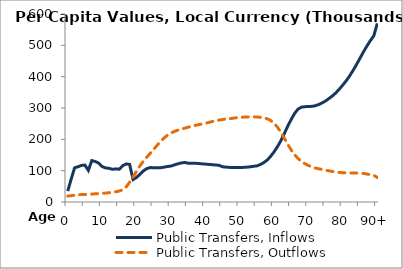
| Category | Public Transfers, Inflows | Public Transfers, Outflows |
|---|---|---|
| 0 | 34879.841 | 18996.704 |
|  | 72892.206 | 20106.775 |
| 2 | 109004.787 | 21738.521 |
| 3 | 112575.426 | 23125.178 |
| 4 | 116744.755 | 23731.721 |
| 5 | 117836.761 | 24202.952 |
| 6 | 100915.563 | 24723.896 |
| 7 | 132222.957 | 25342.67 |
| 8 | 129228.992 | 26212.62 |
| 9 | 124129.336 | 26925.791 |
| 10 | 113133.048 | 27670.958 |
| 11 | 108729.135 | 28435.279 |
| 12 | 107589.406 | 29556.714 |
| 13 | 104226.538 | 30904.255 |
| 14 | 105740.628 | 32718.973 |
| 15 | 104729.964 | 35036.273 |
| 16 | 116117.049 | 38945.816 |
| 17 | 121457.303 | 48446.689 |
| 18 | 120020.654 | 63153.015 |
| 19 | 71570.667 | 80257.789 |
| 20 | 78016.6 | 98097.733 |
| 21 | 88588.573 | 115359.746 |
| 22 | 99195.081 | 130493.272 |
| 23 | 106604.843 | 143275.066 |
| 24 | 109875.766 | 155463.717 |
| 25 | 109397.478 | 168188.511 |
| 26 | 108970.756 | 181076.266 |
| 27 | 109423.452 | 193271.755 |
| 28 | 111268.753 | 204259.217 |
| 29 | 113388.093 | 213332.789 |
| 30 | 114650.589 | 220158.737 |
| 31 | 118428.779 | 225096.363 |
| 32 | 121774.899 | 229092.545 |
| 33 | 124530.019 | 232438.655 |
| 34 | 126117.739 | 235542.268 |
| 35 | 123720.122 | 238771.463 |
| 36 | 123834.399 | 241770.445 |
| 37 | 123571.686 | 244261.067 |
| 38 | 122849.816 | 246691.266 |
| 39 | 121833.739 | 249056.987 |
| 40 | 120987.265 | 251240.786 |
| 41 | 120015.77 | 253834.051 |
| 42 | 119079.863 | 256817.554 |
| 43 | 118131.9 | 259210.635 |
| 44 | 117010.485 | 261223.044 |
| 45 | 112487.352 | 263313.799 |
| 46 | 111366.845 | 264850.904 |
| 47 | 110502.617 | 265791.895 |
| 48 | 110117.092 | 267324.366 |
| 49 | 110040.832 | 268995.621 |
| 50 | 110015.663 | 270032.667 |
| 51 | 110432.444 | 270879.205 |
| 52 | 111171.743 | 271483.672 |
| 53 | 112197.302 | 271823.613 |
| 54 | 113915.883 | 271829.135 |
| 55 | 115224.67 | 271266.613 |
| 56 | 119598.046 | 270278.473 |
| 57 | 125618.373 | 268769.37 |
| 58 | 133993.251 | 265784.644 |
| 59 | 145882.989 | 260190.746 |
| 60 | 160260.551 | 251477.212 |
| 61 | 176921.336 | 238599.941 |
| 62 | 196097.762 | 221998.219 |
| 63 | 218974.791 | 203059.57 |
| 64 | 242843.909 | 183460.413 |
| 65 | 264054.245 | 165328.163 |
| 66 | 283288.735 | 150438.964 |
| 67 | 296904.622 | 138450.485 |
| 68 | 302795.659 | 129081.87 |
| 69 | 304226.54 | 122068.272 |
| 70 | 304804.764 | 116376.379 |
| 71 | 305292.982 | 111763.555 |
| 72 | 307265.685 | 108469.424 |
| 73 | 311080.73 | 105922.46 |
| 74 | 316287.06 | 103659.77 |
| 75 | 322787.963 | 101600.873 |
| 76 | 330609.173 | 99475.626 |
| 77 | 338951.656 | 97381.053 |
| 78 | 348800.527 | 95720.072 |
| 79 | 360690.184 | 94313.598 |
| 80 | 373604.956 | 93402.303 |
| 81 | 387345.272 | 92687.321 |
| 82 | 403038.973 | 92593.052 |
| 83 | 420528.151 | 92634.691 |
| 84 | 439430.782 | 92689.054 |
| 85 | 459447.061 | 92389.515 |
| 86 | 479433 | 91204.954 |
| 87 | 498164.255 | 89325.749 |
| 88 | 515203.644 | 87310.07 |
| 89 | 530467.6 | 85017.206 |
| 90+ | 570183.848 | 78387.047 |